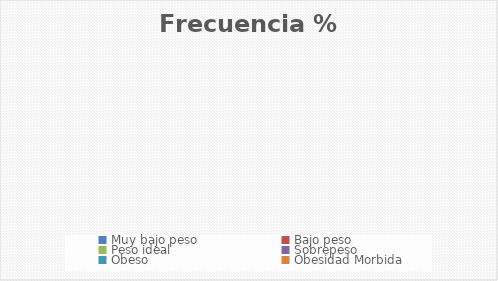
| Category | Frecuencia % |
|---|---|
| Muy bajo peso | 0 |
| Bajo peso | 0 |
| Peso ideal | 0 |
| Sobrepeso | 0 |
| Obeso | 0 |
| Obesidad Morbida | 0 |